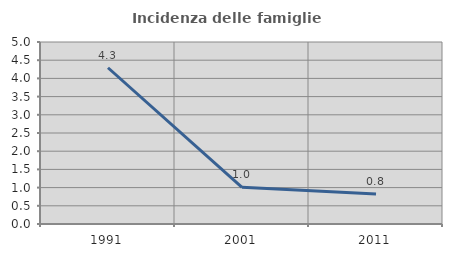
| Category | Incidenza delle famiglie numerose |
|---|---|
| 1991.0 | 4.293 |
| 2001.0 | 1.009 |
| 2011.0 | 0.822 |